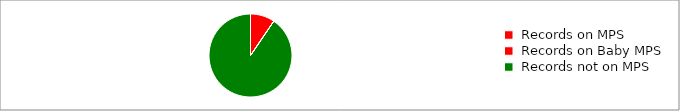
| Category | Series 0 |
|---|---|
|  Records on MPS  | 7238 |
|  Records on Baby MPS  | 0 |
|  Records not on MPS  | 69082 |